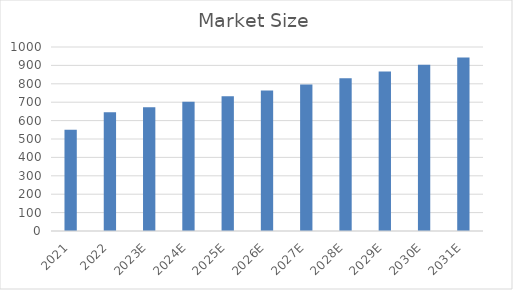
| Category | Market Size |
|---|---|
| 2021 | 550.29 |
| 2022 | 645.2 |
| 2023E | 672.944 |
| 2024E | 701.88 |
| 2025E | 732.061 |
| 2026E | 763.54 |
| 2027E | 796.372 |
| 2028E | 830.616 |
| 2029E | 866.332 |
| 2030E | 903.585 |
| 2031E | 942.439 |